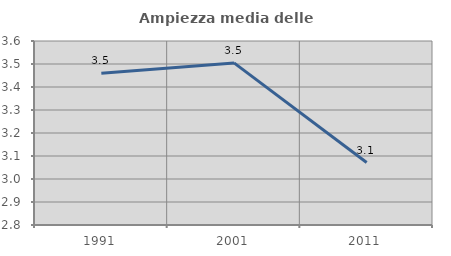
| Category | Ampiezza media delle famiglie |
|---|---|
| 1991.0 | 3.46 |
| 2001.0 | 3.505 |
| 2011.0 | 3.071 |